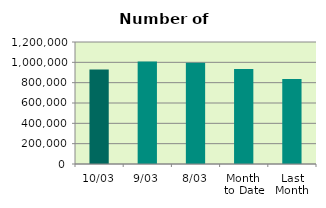
| Category | Series 0 |
|---|---|
| 10/03 | 929668 |
| 9/03 | 1008412 |
| 8/03 | 996996 |
| Month 
to Date | 933391.5 |
| Last
Month | 836497.7 |